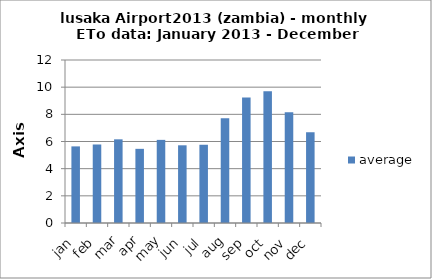
| Category | average |
|---|---|
| jan | 5.64 |
| feb | 5.78 |
| mar | 6.16 |
| apr | 5.46 |
| may | 6.12 |
| jun | 5.72 |
| jul | 5.76 |
| aug | 7.72 |
| sep | 9.24 |
| oct | 9.7 |
| nov | 8.16 |
| dec | 6.68 |